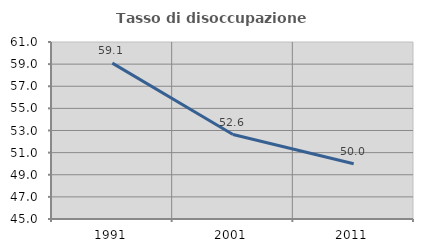
| Category | Tasso di disoccupazione giovanile  |
|---|---|
| 1991.0 | 59.091 |
| 2001.0 | 52.632 |
| 2011.0 | 50 |